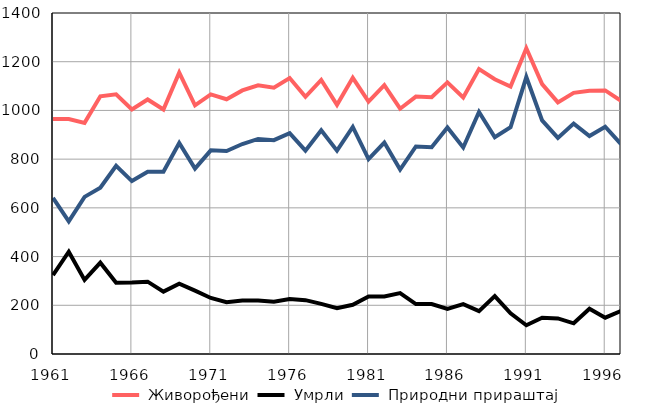
| Category |  Живорођени |  Умрли |  Природни прираштај |
|---|---|---|---|
| 1961.0 | 965 | 324 | 641 |
| 1962.0 | 965 | 420 | 545 |
| 1963.0 | 949 | 304 | 645 |
| 1964.0 | 1058 | 375 | 683 |
| 1965.0 | 1066 | 293 | 773 |
| 1966.0 | 1004 | 294 | 710 |
| 1967.0 | 1045 | 297 | 748 |
| 1968.0 | 1004 | 256 | 748 |
| 1969.0 | 1155 | 289 | 866 |
| 1970.0 | 1021 | 260 | 761 |
| 1971.0 | 1066 | 230 | 836 |
| 1972.0 | 1046 | 213 | 833 |
| 1973.0 | 1082 | 220 | 862 |
| 1974.0 | 1103 | 220 | 883 |
| 1975.0 | 1093 | 215 | 878 |
| 1976.0 | 1133 | 226 | 907 |
| 1977.0 | 1056 | 221 | 835 |
| 1978.0 | 1125 | 206 | 919 |
| 1979.0 | 1023 | 188 | 835 |
| 1980.0 | 1134 | 202 | 932 |
| 1981.0 | 1036 | 236 | 800 |
| 1982.0 | 1104 | 236 | 868 |
| 1983.0 | 1007 | 250 | 757 |
| 1984.0 | 1057 | 205 | 852 |
| 1985.0 | 1054 | 205 | 849 |
| 1986.0 | 1115 | 185 | 930 |
| 1987.0 | 1053 | 205 | 848 |
| 1988.0 | 1170 | 176 | 994 |
| 1989.0 | 1128 | 238 | 890 |
| 1990.0 | 1098 | 167 | 931 |
| 1991.0 | 1255 | 118 | 1137 |
| 1992.0 | 1108 | 149 | 959 |
| 1993.0 | 1033 | 146 | 887 |
| 1994.0 | 1072 | 126 | 946 |
| 1995.0 | 1081 | 186 | 895 |
| 1996.0 | 1082 | 149 | 933 |
| 1997.0 | 1039 | 177 | 862 |